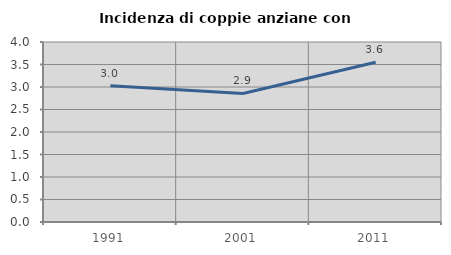
| Category | Incidenza di coppie anziane con figli |
|---|---|
| 1991.0 | 3.03 |
| 2001.0 | 2.857 |
| 2011.0 | 3.55 |